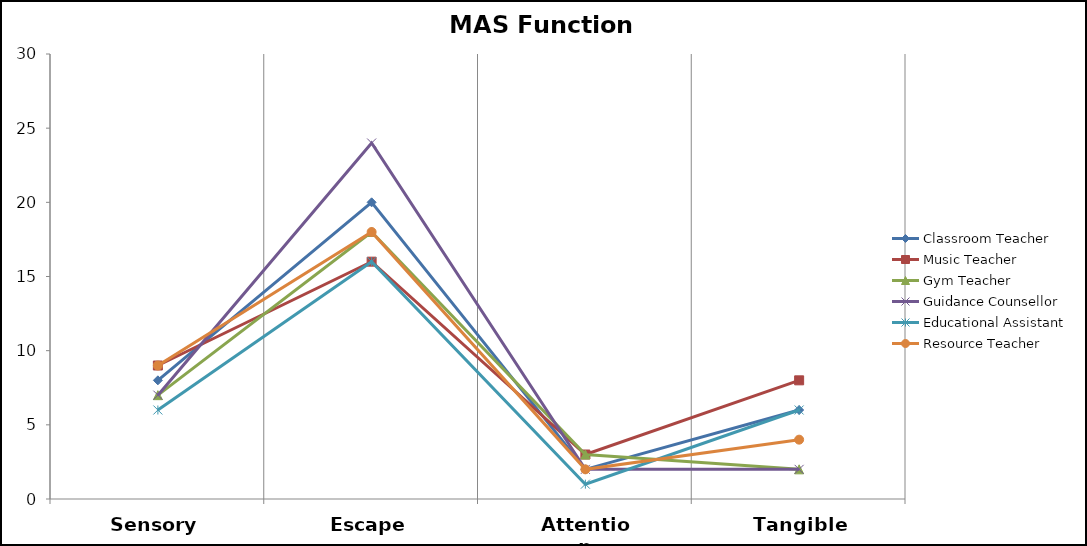
| Category | Classroom Teacher | Music Teacher | Gym Teacher | Guidance Counsellor | Educational Assistant | Resource Teacher |
|---|---|---|---|---|---|---|
| Sensory | 8 | 9 | 7 | 7 | 6 | 9 |
| Escape | 20 | 16 | 18 | 24 | 16 | 18 |
| Attention | 2 | 3 | 3 | 2 | 1 | 2 |
| Tangible | 6 | 8 | 2 | 2 | 6 | 4 |